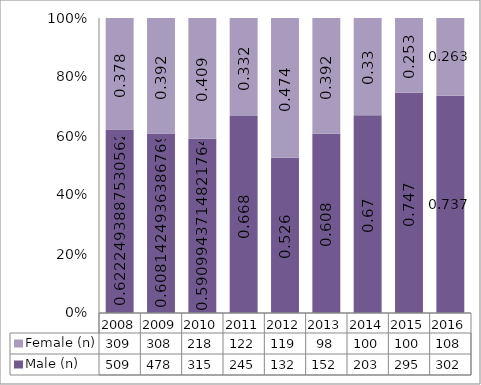
| Category | Male (n) | Female (n) |
|---|---|---|
| 2008.0 | 509 | 309 |
| 2009.0 | 478 | 308 |
| 2010.0 | 315 | 218 |
| 2011.0 | 245 | 122 |
| 2012.0 | 132 | 119 |
| 2013.0 | 152 | 98 |
| 2014.0 | 203 | 100 |
| 2015.0 | 295 | 100 |
| 2016.0 | 302 | 108 |